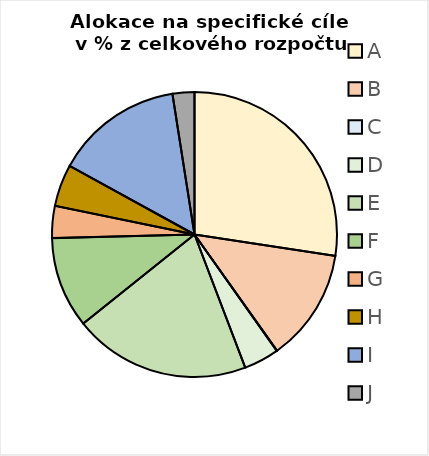
| Category | Series 0 |
|---|---|
| A | 0.274 |
| B | 0.128 |
| C | 0 |
| D | 0.04 |
| E | 0.201 |
| F | 0.103 |
| G | 0.036 |
| H | 0.048 |
| I | 0.145 |
| J | 0.025 |